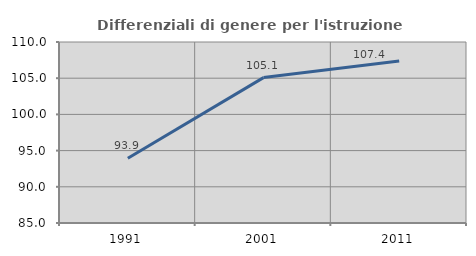
| Category | Differenziali di genere per l'istruzione superiore |
|---|---|
| 1991.0 | 93.936 |
| 2001.0 | 105.085 |
| 2011.0 | 107.365 |